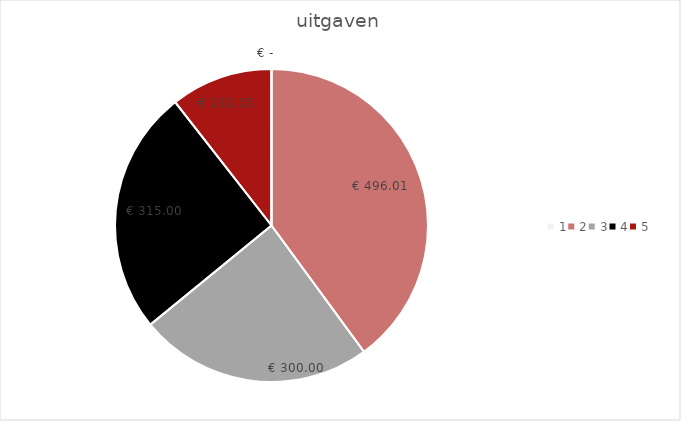
| Category | Series 0 |
|---|---|
| 0 | 0 |
| 1 | 496.01 |
| 2 | 300 |
| 3 | 315 |
| 4 | 131.15 |